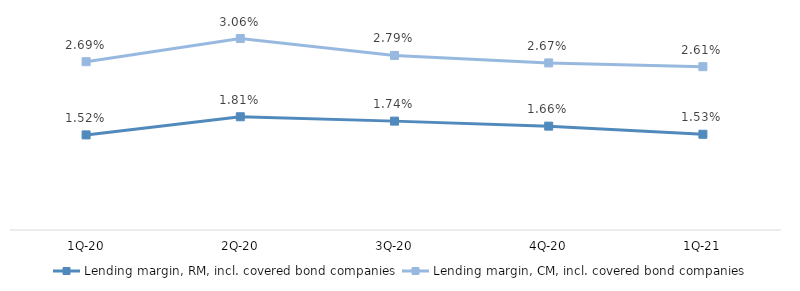
| Category | Lending margin, RM, incl. covered bond companies | Lending margin, CM, incl. covered bond companies |
|---|---|---|
| 1Q-21 | 0.015 | 0.026 |
| 4Q-20 | 0.017 | 0.027 |
| 3Q-20 | 0.017 | 0.028 |
| 2Q-20 | 0.018 | 0.031 |
| 1Q-20 | 0.015 | 0.027 |